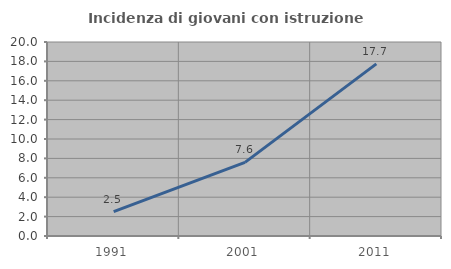
| Category | Incidenza di giovani con istruzione universitaria |
|---|---|
| 1991.0 | 2.508 |
| 2001.0 | 7.595 |
| 2011.0 | 17.742 |